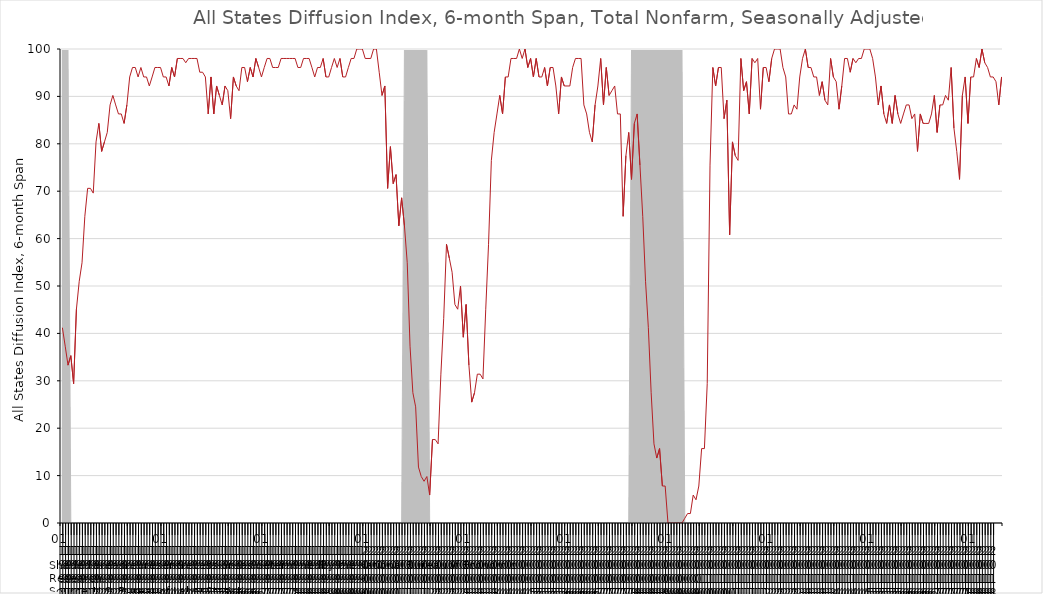
| Category | DI_6month |
|---|---|
| 1991 | 41.2 |
| 1991 | 37.3 |
| 1991 | 33.3 |
| 1991 | 35.3 |
| 1991 | 29.4 |
| 1991 | 45.1 |
| 1991 | 51 |
| 1991 | 54.9 |
| 1991 | 64.7 |
| 1991 | 70.6 |
| 1991 | 70.6 |
| 1991 | 69.6 |
| 1992 | 80.4 |
| 1992 | 84.3 |
| 1992 | 78.4 |
| 1992 | 80.4 |
| 1992 | 82.4 |
| 1992 | 88.2 |
| 1992 | 90.2 |
| 1992 | 88.2 |
| 1992 | 86.3 |
| 1992 | 86.3 |
| 1992 | 84.3 |
| 1992 | 88.2 |
| 1993 | 94.1 |
| 1993 | 96.1 |
| 1993 | 96.1 |
| 1993 | 94.1 |
| 1993 | 96.1 |
| 1993 | 94.1 |
| 1993 | 94.1 |
| 1993 | 92.2 |
| 1993 | 94.1 |
| 1993 | 96.1 |
| 1993 | 96.1 |
| 1993 | 96.1 |
| 1994 | 94.1 |
| 1994 | 94.1 |
| 1994 | 92.2 |
| 1994 | 96.1 |
| 1994 | 94.1 |
| 1994 | 98 |
| 1994 | 98 |
| 1994 | 98 |
| 1994 | 97.1 |
| 1994 | 98 |
| 1994 | 98 |
| 1994 | 98 |
| 1995 | 98 |
| 1995 | 95.1 |
| 1995 | 95.1 |
| 1995 | 94.1 |
| 1995 | 86.3 |
| 1995 | 94.1 |
| 1995 | 86.3 |
| 1995 | 92.2 |
| 1995 | 90.2 |
| 1995 | 88.2 |
| 1995 | 92.2 |
| 1995 | 91.2 |
| 1996 | 85.3 |
| 1996 | 94.1 |
| 1996 | 92.2 |
| 1996 | 91.2 |
| 1996 | 96.1 |
| 1996 | 96.1 |
| 1996 | 93.1 |
| 1996 | 96.1 |
| 1996 | 94.1 |
| 1996 | 98 |
| 1996 | 96.1 |
| 1996 | 94.1 |
| 1997 | 96.1 |
| 1997 | 98 |
| 1997 | 98 |
| 1997 | 96.1 |
| 1997 | 96.1 |
| 1997 | 96.1 |
| 1997 | 98 |
| 1997 | 98 |
| 1997 | 98 |
| 1997 | 98 |
| 1997 | 98 |
| 1997 | 98 |
| 1998 | 96.1 |
| 1998 | 96.1 |
| 1998 | 98 |
| 1998 | 98 |
| 1998 | 98 |
| 1998 | 96.1 |
| 1998 | 94.1 |
| 1998 | 96.1 |
| 1998 | 96.1 |
| 1998 | 98 |
| 1998 | 94.1 |
| 1998 | 94.1 |
| 1999 | 96.1 |
| 1999 | 98 |
| 1999 | 96.1 |
| 1999 | 98 |
| 1999 | 94.1 |
| 1999 | 94.1 |
| 1999 | 96.1 |
| 1999 | 98 |
| 1999 | 98 |
| 1999 | 100 |
| 1999 | 100 |
| 1999 | 100 |
| 2000 | 98 |
| 2000 | 98 |
| 2000 | 98 |
| 2000 | 100 |
| 2000 | 100 |
| 2000 | 95.1 |
| 2000 | 90.2 |
| 2000 | 92.2 |
| 2000 | 70.6 |
| 2000 | 79.4 |
| 2000 | 71.6 |
| 2000 | 73.5 |
| 2001 | 62.7 |
| 2001 | 68.6 |
| 2001 | 62.7 |
| 2001 | 54.9 |
| 2001 | 37.3 |
| 2001 | 27.5 |
| 2001 | 24.5 |
| 2001 | 11.8 |
| 2001 | 9.8 |
| 2001 | 8.8 |
| 2001 | 9.8 |
| 2001 | 5.9 |
| 2002 | 17.6 |
| 2002 | 17.6 |
| 2002 | 16.7 |
| 2002 | 31.4 |
| 2002 | 43.1 |
| 2002 | 58.8 |
| 2002 | 55.9 |
| 2002 | 52.9 |
| 2002 | 46.1 |
| 2002 | 45.1 |
| 2002 | 50 |
| 2002 | 39.2 |
| 2003 | 46.1 |
| 2003 | 33.3 |
| 2003 | 25.5 |
| 2003 | 27.5 |
| 2003 | 31.4 |
| 2003 | 31.4 |
| 2003 | 30.4 |
| 2003 | 45.1 |
| 2003 | 58.8 |
| 2003 | 76.5 |
| 2003 | 82.4 |
| 2003 | 86.3 |
| 2004 | 90.2 |
| 2004 | 86.3 |
| 2004 | 94.1 |
| 2004 | 94.1 |
| 2004 | 98 |
| 2004 | 98 |
| 2004 | 98 |
| 2004 | 100 |
| 2004 | 98 |
| 2004 | 100 |
| 2004 | 96.1 |
| 2004 | 98 |
| 2005 | 94.1 |
| 2005 | 98 |
| 2005 | 94.1 |
| 2005 | 94.1 |
| 2005 | 96.1 |
| 2005 | 92.2 |
| 2005 | 96.1 |
| 2005 | 96.1 |
| 2005 | 92.2 |
| 2005 | 86.3 |
| 2005 | 94.1 |
| 2005 | 92.2 |
| 2006 | 92.2 |
| 2006 | 92.2 |
| 2006 | 96.1 |
| 2006 | 98 |
| 2006 | 98 |
| 2006 | 98 |
| 2006 | 88.2 |
| 2006 | 86.3 |
| 2006 | 82.4 |
| 2006 | 80.4 |
| 2006 | 88.2 |
| 2006 | 92.2 |
| 2007 | 98 |
| 2007 | 88.2 |
| 2007 | 96.1 |
| 2007 | 90.2 |
| 2007 | 91.2 |
| 2007 | 92.2 |
| 2007 | 86.3 |
| 2007 | 86.3 |
| 2007 | 64.7 |
| 2007 | 77.5 |
| 2007 | 82.4 |
| 2007 | 72.5 |
| 2008 | 84.3 |
| 2008 | 86.3 |
| 2008 | 75.5 |
| 2008 | 64.7 |
| 2008 | 51 |
| 2008 | 41.2 |
| 2008 | 27.5 |
| 2008 | 16.7 |
| 2008 | 13.7 |
| 2008 | 15.7 |
| 2008 | 7.8 |
| 2008 | 7.8 |
| 2009 | 0 |
| 2009 | 0 |
| 2009 | 0 |
| 2009 | 0 |
| 2009 | 0 |
| 2009 | 0 |
| 2009 | 1 |
| 2009 | 2 |
| 2009 | 2 |
| 2009 | 5.9 |
| 2009 | 4.9 |
| 2009 | 7.8 |
| 2010 | 15.7 |
| 2010 | 15.7 |
| 2010 | 29.4 |
| 2010 | 75.5 |
| 2010 | 96.1 |
| 2010 | 92.2 |
| 2010 | 96.1 |
| 2010 | 96.1 |
| 2010 | 85.3 |
| 2010 | 89.2 |
| 2010 | 60.8 |
| 2010 | 80.4 |
| 2011 | 77.5 |
| 2011 | 76.5 |
| 2011 | 98 |
| 2011 | 91.2 |
| 2011 | 93.1 |
| 2011 | 86.3 |
| 2011 | 98 |
| 2011 | 97.1 |
| 2011 | 98 |
| 2011 | 87.3 |
| 2011 | 96.1 |
| 2011 | 96.1 |
| 2012 | 93.1 |
| 2012 | 98 |
| 2012 | 100 |
| 2012 | 100 |
| 2012 | 100 |
| 2012 | 96.1 |
| 2012 | 94.1 |
| 2012 | 86.3 |
| 2012 | 86.3 |
| 2012 | 88.2 |
| 2012 | 87.3 |
| 2012 | 94.1 |
| 2013 | 98 |
| 2013 | 100 |
| 2013 | 96.1 |
| 2013 | 96.1 |
| 2013 | 94.1 |
| 2013 | 94.1 |
| 2013 | 90.2 |
| 2013 | 93.1 |
| 2013 | 89.2 |
| 2013 | 88.2 |
| 2013 | 98 |
| 2013 | 94.1 |
| 2014 | 93.1 |
| 2014 | 87.3 |
| 2014 | 92.2 |
| 2014 | 98 |
| 2014 | 98 |
| 2014 | 95.1 |
| 2014 | 98 |
| 2014 | 97.1 |
| 2014 | 98 |
| 2014 | 98 |
| 2014 | 100 |
| 2014 | 100 |
| 2015 | 100 |
| 2015 | 98 |
| 2015 | 94.1 |
| 2015 | 88.2 |
| 2015 | 92.2 |
| 2015 | 86.3 |
| 2015 | 84.3 |
| 2015 | 88.2 |
| 2015 | 84.3 |
| 2015 | 90.2 |
| 2015 | 86.3 |
| 2015 | 84.3 |
| 2016 | 86.3 |
| 2016 | 88.2 |
| 2016 | 88.2 |
| 2016 | 85.3 |
| 2016 | 86.3 |
| 2016 | 78.4 |
| 2016 | 86.3 |
| 2016 | 84.3 |
| 2016 | 84.3 |
| 2016 | 84.3 |
| 2016 | 86.3 |
| 2016 | 90.2 |
| 2017 | 82.4 |
| 2017 | 88.2 |
| 2017 | 88.2 |
| 2017 | 90.2 |
| 2017 | 89.2 |
| 2017 | 96.1 |
| 2017 | 83.3 |
| 2017 | 78.4 |
| 2017 | 72.5 |
| 2017 | 90.2 |
| 2017 | 94.1 |
| 2017 | 84.3 |
| 2018 | 94.1 |
| 2018 | 94.1 |
| 2018 | 98 |
| 2018 | 96.1 |
| 2018 | 100 |
| 2018 | 97.1 |
| 2018 | 96.1 |
| 2018 | 94.1 |
| 2018 | 94.1 |
| 2018 | 93.1 |
| 2018 | 88.2 |
| 2018 | 94.1 |